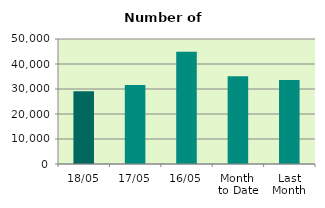
| Category | Series 0 |
|---|---|
| 18/05 | 29122 |
| 17/05 | 31568 |
| 16/05 | 44922 |
| Month 
to Date | 35134.769 |
| Last
Month | 33588.111 |